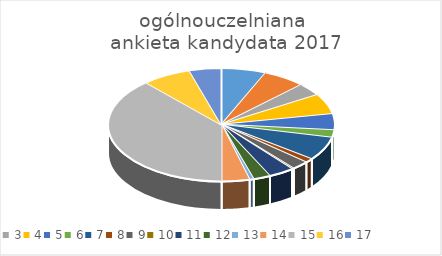
| Category | Series 0 |
|---|---|
| 0 | 21 |
| 1 | 20 |
| 2 | 12 |
| 3 | 19 |
| 4 | 15 |
| 5 | 7 |
| 6 | 22 |
| 7 | 4 |
| 8 | 8 |
| 9 | 1 |
| 10 | 12 |
| 11 | 8 |
| 12 | 2 |
| 13 | 13 |
| 14 | 126 |
| 15 | 23 |
| 16 | 15 |